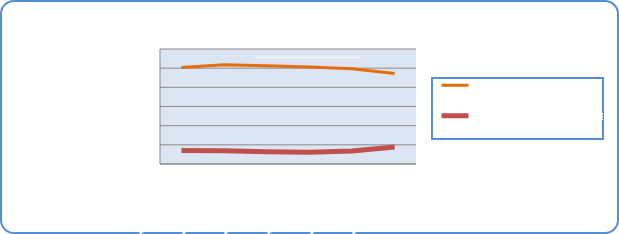
| Category | Motorin Türleri | Benzin Türleri |
|---|---|---|
| 2/17/20 | 50346613.624 | 6981169.12 |
| 2/18/20 | 51754193.065 | 6890019.684 |
| 2/19/20 | 51309521.105 | 6391435.957 |
| 2/20/20 | 50558604.662 | 6186160.095 |
| 2/21/20 | 49644811.242 | 6769326.518 |
| 2/22/20 | 47261345.326 | 8861676.138 |